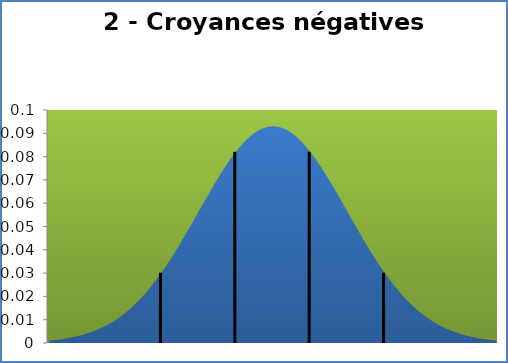
| Category | Series 1 |
|---|---|
| 0.46000000000000085 | 0.001 |
| 0.6745000000000001 | 0.001 |
| 0.8890000000000011 | 0.001 |
| 1.1035000000000004 | 0.002 |
| 1.3179999999999996 | 0.002 |
| 1.5325000000000006 | 0.002 |
| 1.7469999999999999 | 0.002 |
| 1.9614999999999991 | 0.003 |
| 2.176 | 0.003 |
| 2.390500000000001 | 0.004 |
| 2.6050000000000004 | 0.004 |
| 2.8194999999999997 | 0.005 |
| 3.033999999999999 | 0.005 |
| 3.2485 | 0.006 |
| 3.462999999999999 | 0.007 |
| 3.6775 | 0.007 |
| 3.8920000000000012 | 0.008 |
| 4.1065000000000005 | 0.009 |
| 4.321 | 0.01 |
| 4.535499999999999 | 0.011 |
| 4.75 | 0.013 |
| 4.964499999999999 | 0.014 |
| 5.179 | 0.015 |
| 5.3935 | 0.017 |
| 5.6080000000000005 | 0.018 |
| 5.8225 | 0.02 |
| 6.036999999999999 | 0.022 |
| 6.2515 | 0.024 |
| 6.466 | 0.026 |
| 6.680499999999999 | 0.028 |
| 6.8950000000000005 | 0.03 |
| 7.109500000000001 | 0.033 |
| 7.324 | 0.035 |
| 7.5385 | 0.037 |
| 7.753 | 0.04 |
| 7.9675 | 0.043 |
| 8.181999999999999 | 0.045 |
| 8.3965 | 0.048 |
| 8.611 | 0.051 |
| 8.8255 | 0.054 |
| 9.04 | 0.056 |
| 9.2545 | 0.059 |
| 9.469000000000001 | 0.062 |
| 9.683499999999999 | 0.065 |
| 9.898 | 0.068 |
| 10.1125 | 0.07 |
| 10.327 | 0.073 |
| 10.5415 | 0.075 |
| 10.756 | 0.078 |
| 10.970500000000001 | 0.08 |
| 11.185 | 0.082 |
| 11.3995 | 0.084 |
| 11.614 | 0.086 |
| 11.8285 | 0.087 |
| 12.043 | 0.089 |
| 12.2575 | 0.09 |
| 12.472 | 0.091 |
| 12.6865 | 0.092 |
| 12.901 | 0.093 |
| 13.1155 | 0.093 |
| 13.33 | 0.093 |
| 13.5445 | 0.093 |
| 13.759 | 0.093 |
| 13.9735 | 0.092 |
| 14.188 | 0.091 |
| 14.4025 | 0.09 |
| 14.617 | 0.089 |
| 14.8315 | 0.087 |
| 15.046 | 0.086 |
| 15.2605 | 0.084 |
| 15.475 | 0.082 |
| 15.689499999999999 | 0.08 |
| 15.904 | 0.078 |
| 16.1185 | 0.075 |
| 16.333 | 0.073 |
| 16.5475 | 0.07 |
| 16.762 | 0.068 |
| 16.9765 | 0.065 |
| 17.191 | 0.062 |
| 17.4055 | 0.059 |
| 17.62 | 0.056 |
| 17.8345 | 0.054 |
| 18.049 | 0.051 |
| 18.2635 | 0.048 |
| 18.478 | 0.045 |
| 18.6925 | 0.043 |
| 18.907 | 0.04 |
| 19.1215 | 0.037 |
| 19.336 | 0.035 |
| 19.5505 | 0.033 |
| 19.765 | 0.03 |
| 19.9795 | 0.028 |
| 20.194 | 0.026 |
| 20.4085 | 0.024 |
| 20.623 | 0.022 |
| 20.8375 | 0.02 |
| 21.052 | 0.018 |
| 21.2665 | 0.017 |
| 21.481 | 0.015 |
| 21.695500000000003 | 0.014 |
| 21.91 | 0.013 |
| 22.1245 | 0.011 |
| 22.339 | 0.01 |
| 22.5535 | 0.009 |
| 22.768 | 0.008 |
| 22.9825 | 0.007 |
| 23.197000000000003 | 0.007 |
| 23.4115 | 0.006 |
| 23.626 | 0.005 |
| 23.8405 | 0.005 |
| 24.055 | 0.004 |
| 24.2695 | 0.004 |
| 24.484 | 0.003 |
| 24.698500000000003 | 0.003 |
| 24.913 | 0.002 |
| 25.127499999999998 | 0.002 |
| 25.342 | 0.002 |
| 25.5565 | 0.002 |
| 25.771 | 0.001 |
| 25.985500000000002 | 0.001 |
| 26.2 | 0.001 |